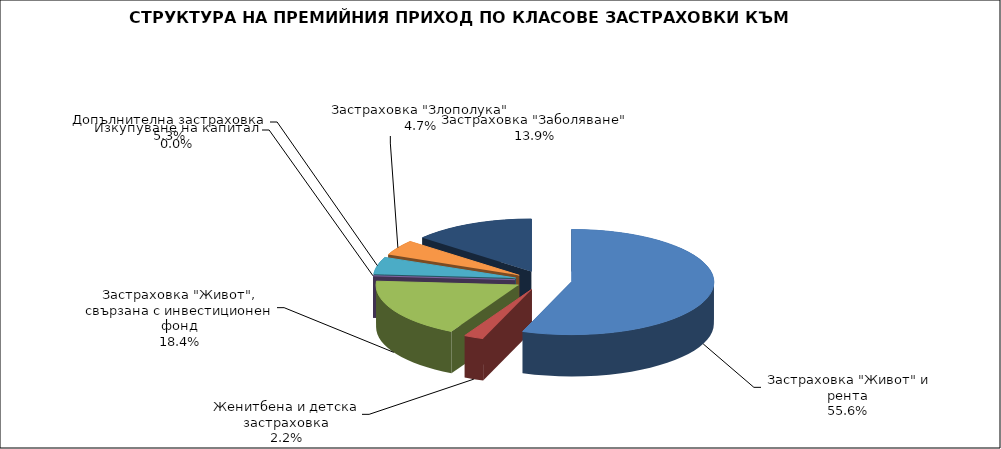
| Category |  Застраховка "Живот" и рента |
|---|---|
|  Застраховка "Живот" и рента | 180584916.975 |
| Женитбена и детска застраховка | 7309130.858 |
| Застраховка "Живот", свързана с инвестиционен фонд | 59684093.853 |
| Изкупуване на капитал | 0 |
| Допълнителна застраховка | 17148333.782 |
| Застраховка "Злополука" | 15217722.62 |
| Застраховка "Заболяване" | 45122222.18 |